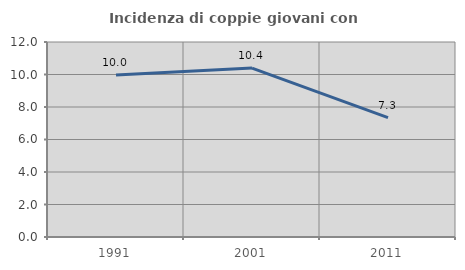
| Category | Incidenza di coppie giovani con figli |
|---|---|
| 1991.0 | 9.966 |
| 2001.0 | 10.398 |
| 2011.0 | 7.343 |